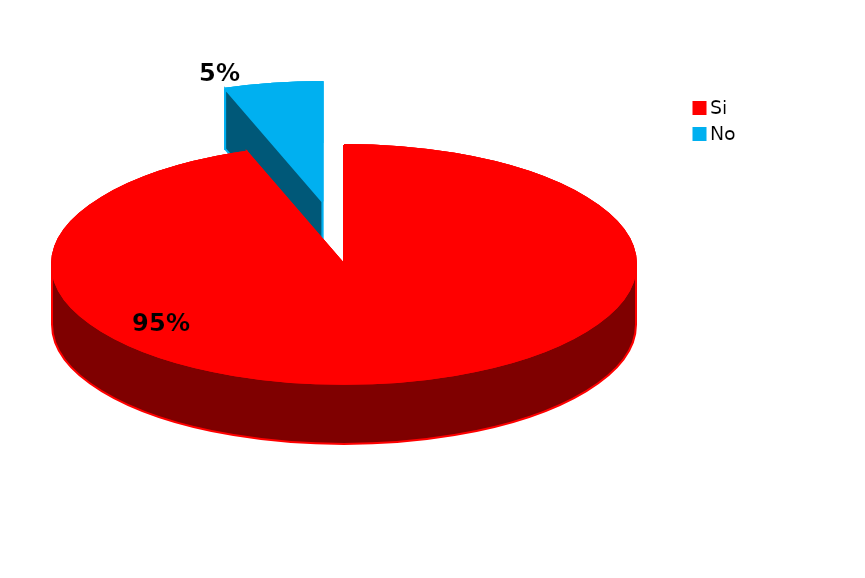
| Category | Series 0 |
|---|---|
| Si | 70 |
| No | 4 |